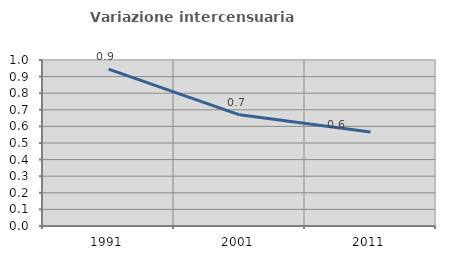
| Category | Variazione intercensuaria annua |
|---|---|
| 1991.0 | 0.945 |
| 2001.0 | 0.67 |
| 2011.0 | 0.567 |